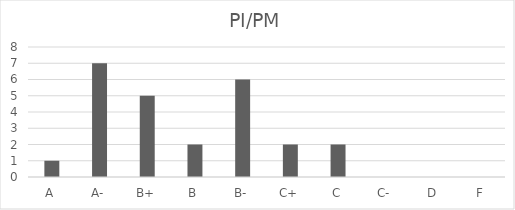
| Category | PI/PM |
|---|---|
| A | 1 |
| A- | 7 |
| B+ | 5 |
| B | 2 |
| B- | 6 |
| C+ | 2 |
| C | 2 |
| C- | 0 |
| D | 0 |
| F | 0 |